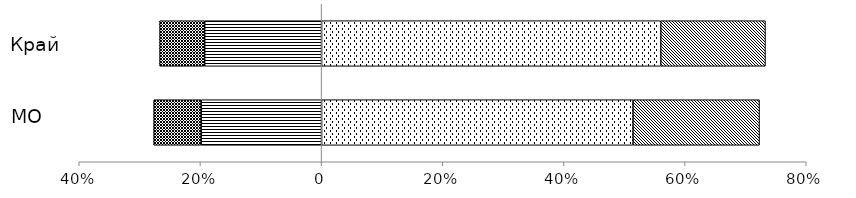
| Category | Пониженный | Недостаточный | Базовый | Повышенный |
|---|---|---|---|---|
|  | -0.199 | -0.078 | 0.514 | 0.209 |
|  | -0.193 | -0.074 | 0.56 | 0.173 |